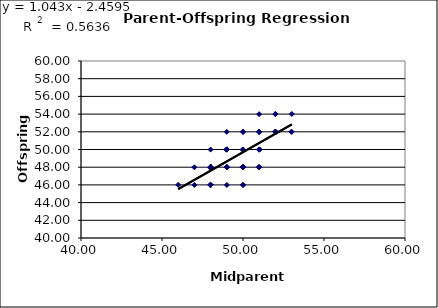
| Category | Series 0 |
|---|---|
| 48.9962878638804 | 50.009 |
| 48.00247994741794 | 47.992 |
| 50.99573752557284 | 53.995 |
| 51.99772653844481 | 54.006 |
| 49.99366548501597 | 50.003 |
| 50.97782943994979 | 48.003 |
| 47.99675840781961 | 47.987 |
| 47.00131984339217 | 45.996 |
| 49.995917004658125 | 49.996 |
| 48.00104272875489 | 47.993 |
| 49.002481431830304 | 49.998 |
| 48.011947340890785 | 48.009 |
| 49.00256251139938 | 49.999 |
| 49.0041446146569 | 47.993 |
| 47.99209168819934 | 47.987 |
| 49.99754289326849 | 49.994 |
| 49.00809310946187 | 47.978 |
| 48.99590213512772 | 48.009 |
| 49.0009690979406 | 48.001 |
| 48.99076020499888 | 49.991 |
| 52.01108111713734 | 51.989 |
| 47.99518325361332 | 45.995 |
| 50.995380942610325 | 52.012 |
| 50.99886632128947 | 52.019 |
| 47.982195667876894 | 45.996 |
| 50.00422745423784 | 48.005 |
| 49.99639452661789 | 49.987 |
| 52.008402343141796 | 51.994 |
| 48.99962496084922 | 50.008 |
| 49.00988122457325 | 50.014 |
| 51.00559823916876 | 51.999 |
| 53.01321564476167 | 54.01 |
| 48.004123960290585 | 48.005 |
| 49.00477384315497 | 47.999 |
| 48.00864994473313 | 48.009 |
| 46.99814842382568 | 47.988 |
| 51.00382713935704 | 52.007 |
| 51.98716390163469 | 52.003 |
| 49.00095152598439 | 45.995 |
| 50.00774617517952 | 52.001 |
| 52.001920643695435 | 51.99 |
| 47.99319895923465 | 47.994 |
| 52.998113522209884 | 52.006 |
| 50.00436662158025 | 47.996 |
| 50.984157790287675 | 52 |
| 51.00719124011647 | 50.002 |
| 50.98435580467605 | 49.996 |
| 47.996658179067836 | 48.013 |
| 49.003051320619164 | 48.002 |
| 48.00490130489081 | 47.993 |
| 52.00055262838444 | 52 |
| 51.998393784318665 | 52.014 |
| 50.00381437880636 | 51.99 |
| 52.005971426905745 | 51.998 |
| 51.001390610808215 | 48.007 |
| 50.00632509749257 | 45.984 |
| 47.991857225089674 | 47.996 |
| 47.994154336184764 | 46 |
| 50.999219246674315 | 50.001 |
| 48.00864448503832 | 48.004 |
| 51.00029715140662 | 51.993 |
| 48.99285262816925 | 49.993 |
| 51.00533575086807 | 51.992 |
| 50.00874069902469 | 48.004 |
| 48.996901015548396 | 51.999 |
| 52.01084488341242 | 51.991 |
| 49.994589109038685 | 48.001 |
| 47.99834945418829 | 47.963 |
| 52.007508681387776 | 51.986 |
| 48.008699729422254 | 46.014 |
| 50.003939138219934 | 50.004 |
| 49.99043566893961 | 47.992 |
| 48.01080459552645 | 48.008 |
| 51.00111310707652 | 49.983 |
| 49.998135035323564 | 48.006 |
| 49.9951398455207 | 49.995 |
| 50.00207213349056 | 49.996 |
| 48.01219938981701 | 48.014 |
| 49.99722717891838 | 46.011 |
| 50.99595210486923 | 48.009 |
| 51.002005546534555 | 50.008 |
| 49.99902574049729 | 47.99 |
| 49.98831756087142 | 49.994 |
| 49.998729034724796 | 49.985 |
| 49.99918200013991 | 52.008 |
| 49.999962405737875 | 48.002 |
| 51.99717364013488 | 54.005 |
| 47.996175743639554 | 47.991 |
| 48.99226969604531 | 49.982 |
| 49.00939819575147 | 47.997 |
| 48.0000195516846 | 49.991 |
| 51.00439024482076 | 49.989 |
| 51.00560883670603 | 49.997 |
| 45.99855216226146 | 46.007 |
| 48.006416969442554 | 48.002 |
| 50.00047596651311 | 48 |
| 52.98902488664161 | 51.997 |
| 48.00091274864705 | 45.989 |
| 50.00238733634786 | 49.986 |
| 47.98756227925581 | 46.011 |